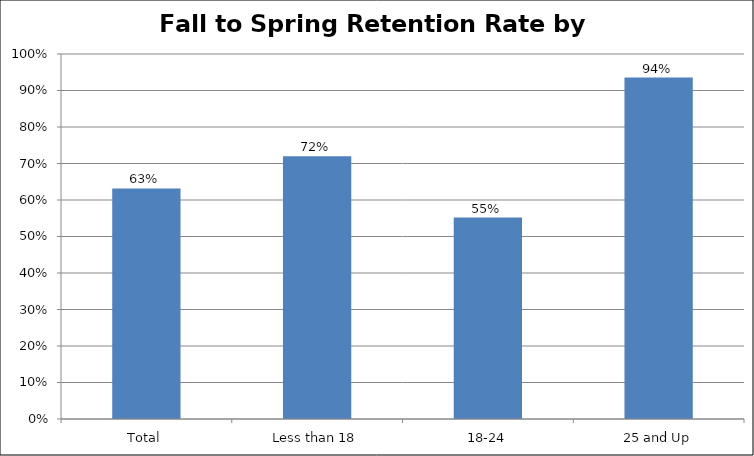
| Category | Fall to Spring Retention Rate for POS Students |
|---|---|
| Total | 0.632 |
| Less than 18 | 0.72 |
| 18-24 | 0.552 |
| 25 and Up | 0.935 |